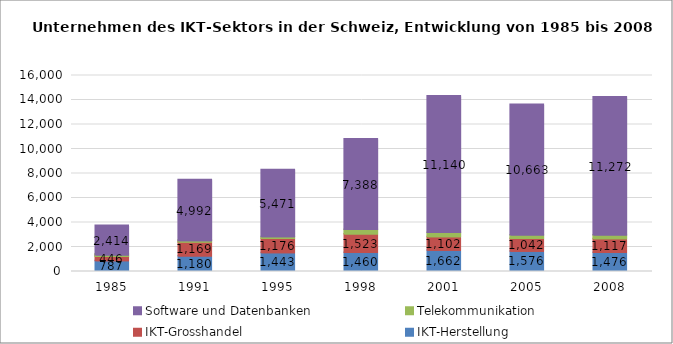
| Category | IKT-Herstellung | IKT-Grosshandel | Telekommunikation | Software und Datenbanken |
|---|---|---|---|---|
| 1985.0 | 787 | 446 | 30 | 2414 |
| 1991.0 | 1180 | 1169 | 74 | 4992 |
| 1995.0 | 1443 | 1176 | 142 | 5471 |
| 1998.0 | 1460 | 1523 | 361 | 7388 |
| 2001.0 | 1662 | 1102 | 344 | 11140 |
| 2005.0 | 1576 | 1042 | 278 | 10663 |
| 2008.0 | 1476 | 1117 | 296 | 11272 |